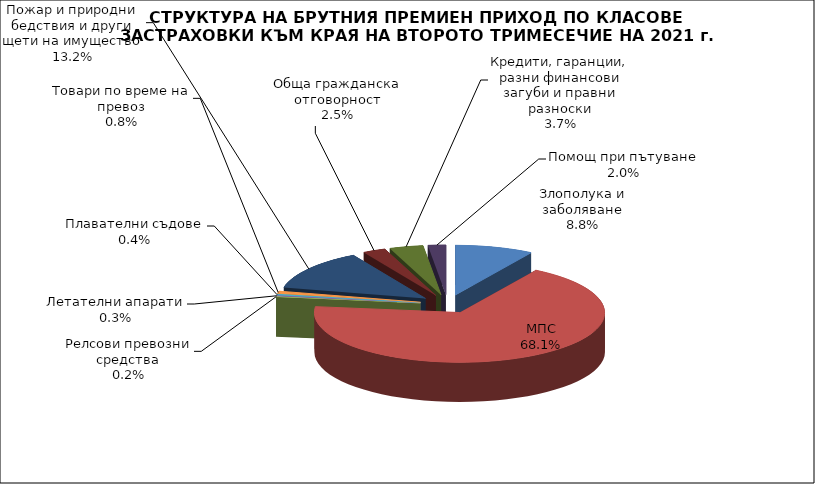
| Category | Злополука и заболяване |
|---|---|
| Злополука и заболяване | 0.088 |
| МПС | 0.681 |
| Релсови превозни средства | 0.002 |
| Летателни апарати | 0.003 |
| Плавателни съдове | 0.004 |
| Товари по време на превоз | 0.008 |
| Пожар и природни бедствия и други щети на имущество | 0.132 |
| Обща гражданска отговорност | 0.025 |
| Кредити, гаранции, разни финансови загуби и правни разноски | 0.037 |
| Помощ при пътуване | 0.02 |